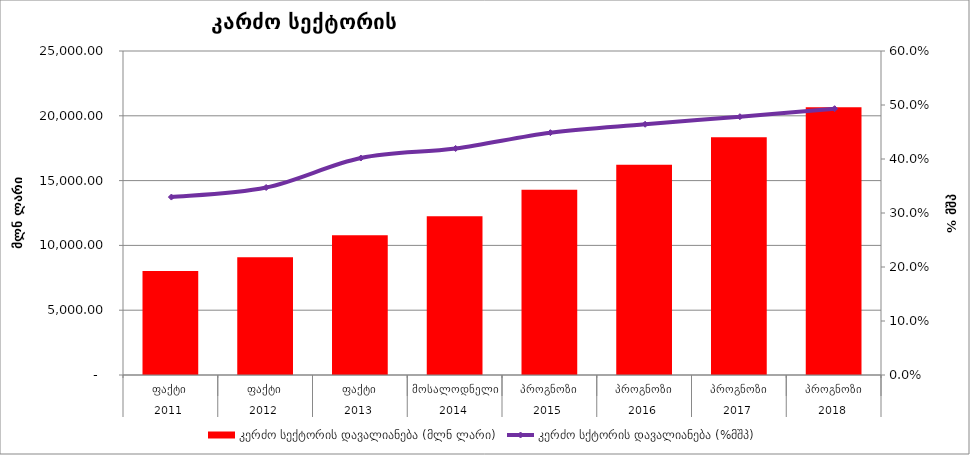
| Category | კერძო სექტორის დავალიანება (მლნ ლარი) |
|---|---|
| 0 | 8021.579 |
| 1 | 9085.662 |
| 2 | 10787.395 |
| 3 | 12240.38 |
| 4 | 14297.72 |
| 5 | 16232.13 |
| 6 | 18347.04 |
| 7 | 20655.34 |